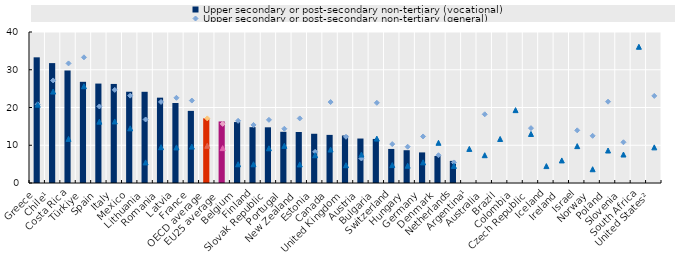
| Category | Upper secondary or post-secondary non-tertiary (vocational) |
|---|---|
| Greece | 33.291 |
| Chile¹ | 31.76 |
| Costa Rica | 29.805 |
| Türkiye | 26.801 |
| Spain | 26.339 |
| Italy | 26.244 |
| Mexico | 24.177 |
| Lithuania | 24.161 |
| Romania | 22.607 |
| Latvia | 21.19 |
| France | 19.105 |
| OECD average | 17.147 |
| EU25 average | 16.302 |
| Belgium | 16.146 |
| Finland | 14.789 |
| Slovak Republic | 14.753 |
| Portugal | 13.563 |
| New Zealand | 13.51 |
| Estonia | 13.043 |
| Canada | 12.745 |
| United Kingdom | 12.585 |
| Austria | 11.779 |
| Bulgaria | 11.674 |
| Switzerland | 9.024 |
| Hungary | 8.684 |
| Germany | 8.103 |
| Denmark | 7.145 |
| Netherlands | 5.863 |
| Argentina¹ | 0 |
| Australia | 0 |
| Brazil | 0 |
| Colombia | 0 |
| Czech Republic | 0 |
| Iceland | 0 |
| Ireland | 0 |
| Israel | 0 |
| Norway | 0 |
| Poland | 0 |
| Slovenia | 0 |
| South Africa | 0 |
| United States² | 0 |